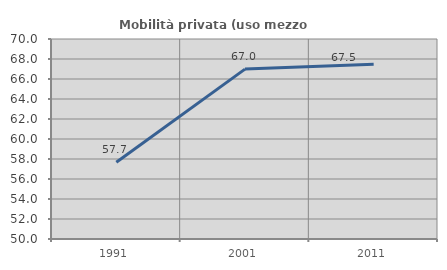
| Category | Mobilità privata (uso mezzo privato) |
|---|---|
| 1991.0 | 57.668 |
| 2001.0 | 66.989 |
| 2011.0 | 67.483 |